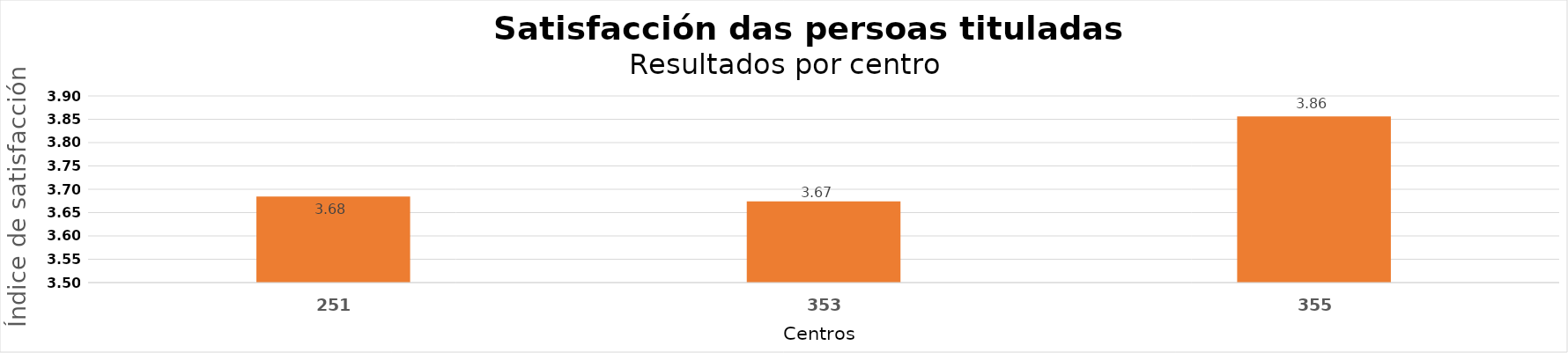
| Category | Series 0 |
|---|---|
| 251.0 | 3.684 |
| 353.0 | 3.674 |
| 355.0 | 3.856 |